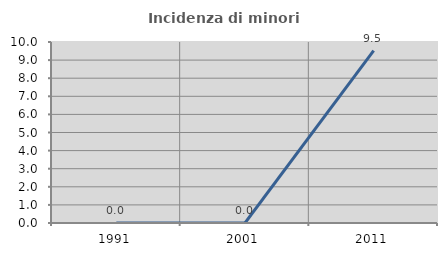
| Category | Incidenza di minori stranieri |
|---|---|
| 1991.0 | 0 |
| 2001.0 | 0 |
| 2011.0 | 9.524 |